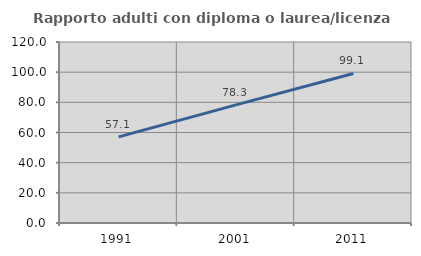
| Category | Rapporto adulti con diploma o laurea/licenza media  |
|---|---|
| 1991.0 | 57.067 |
| 2001.0 | 78.323 |
| 2011.0 | 99.118 |